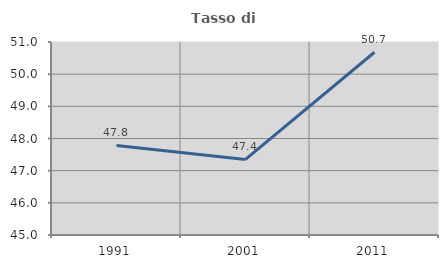
| Category | Tasso di occupazione   |
|---|---|
| 1991.0 | 47.786 |
| 2001.0 | 47.351 |
| 2011.0 | 50.681 |